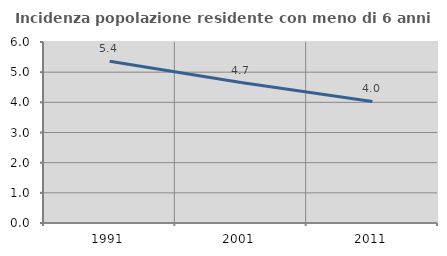
| Category | Incidenza popolazione residente con meno di 6 anni |
|---|---|
| 1991.0 | 5.359 |
| 2001.0 | 4.657 |
| 2011.0 | 4.029 |